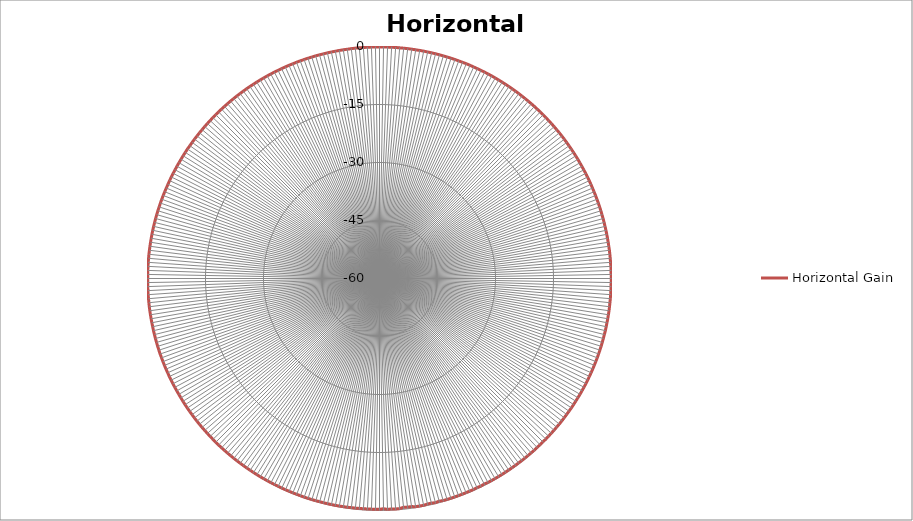
| Category | Horizontal Gain |
|---|---|
| 0 | -0.12 |
| 1 | -0.11 |
| 2 | -0.12 |
| 3 | -0.11 |
| 4 | -0.11 |
| 5 | -0.12 |
| 6 | -0.11 |
| 7 | -0.11 |
| 8 | -0.11 |
| 9 | -0.12 |
| 10 | -0.11 |
| 11 | -0.1 |
| 12 | -0.11 |
| 13 | -0.1 |
| 14 | -0.1 |
| 15 | -0.1 |
| 16 | -0.11 |
| 17 | -0.11 |
| 18 | -0.1 |
| 19 | -0.1 |
| 20 | -0.11 |
| 21 | -0.11 |
| 22 | -0.09 |
| 23 | -0.1 |
| 24 | -0.12 |
| 25 | -0.12 |
| 26 | -0.12 |
| 27 | -0.11 |
| 28 | -0.11 |
| 29 | -0.11 |
| 30 | -0.12 |
| 31 | -0.13 |
| 32 | -0.12 |
| 33 | -0.14 |
| 34 | -0.13 |
| 35 | -0.13 |
| 36 | -0.13 |
| 37 | -0.13 |
| 38 | -0.14 |
| 39 | -0.14 |
| 40 | -0.14 |
| 41 | -0.14 |
| 42 | -0.13 |
| 43 | -0.14 |
| 44 | -0.15 |
| 45 | -0.14 |
| 46 | -0.14 |
| 47 | -0.16 |
| 48 | -0.15 |
| 49 | -0.16 |
| 50 | -0.16 |
| 51 | -0.15 |
| 52 | -0.15 |
| 53 | -0.16 |
| 54 | -0.16 |
| 55 | -0.17 |
| 56 | -0.17 |
| 57 | -0.16 |
| 58 | -0.16 |
| 59 | -0.16 |
| 60 | -0.17 |
| 61 | -0.16 |
| 62 | -0.17 |
| 63 | -0.15 |
| 64 | -0.16 |
| 65 | -0.15 |
| 66 | -0.15 |
| 67 | -0.16 |
| 68 | -0.16 |
| 69 | -0.15 |
| 70 | -0.15 |
| 71 | -0.14 |
| 72 | -0.14 |
| 73 | -0.14 |
| 74 | -0.15 |
| 75 | -0.14 |
| 76 | -0.13 |
| 77 | -0.14 |
| 78 | -0.13 |
| 79 | -0.13 |
| 80 | -0.13 |
| 81 | -0.12 |
| 82 | -0.12 |
| 83 | -0.1 |
| 84 | -0.1 |
| 85 | -0.1 |
| 86 | -0.11 |
| 87 | -0.09 |
| 88 | -0.09 |
| 89 | -0.08 |
| 90 | -0.08 |
| 91 | -0.08 |
| 92 | -0.08 |
| 93 | -0.08 |
| 94 | -0.08 |
| 95 | -0.08 |
| 96 | -0.08 |
| 97 | -0.07 |
| 98 | -0.06 |
| 99 | -0.06 |
| 100 | -0.06 |
| 101 | -0.08 |
| 102 | -0.06 |
| 103 | -0.05 |
| 104 | -0.07 |
| 105 | -0.07 |
| 106 | -0.07 |
| 107 | -0.06 |
| 108 | -0.07 |
| 109 | -0.07 |
| 110 | -0.07 |
| 111 | -0.08 |
| 112 | -0.09 |
| 113 | -0.09 |
| 114 | -0.09 |
| 115 | -0.1 |
| 116 | -0.1 |
| 117 | -0.1 |
| 118 | -0.11 |
| 119 | -0.12 |
| 120 | -0.12 |
| 121 | -0.14 |
| 122 | -0.15 |
| 123 | -0.15 |
| 124 | -0.15 |
| 125 | -0.17 |
| 126 | -0.18 |
| 127 | -0.18 |
| 128 | -0.17 |
| 129 | -0.18 |
| 130 | -0.2 |
| 131 | -0.2 |
| 132 | -0.21 |
| 133 | -0.21 |
| 134 | -0.21 |
| 135 | -0.23 |
| 136 | -0.25 |
| 137 | -0.24 |
| 138 | -0.23 |
| 139 | -0.24 |
| 140 | -0.24 |
| 141 | -0.24 |
| 142 | -0.24 |
| 143 | -0.26 |
| 144 | -0.25 |
| 145 | -0.26 |
| 146 | -0.25 |
| 147 | -0.25 |
| 148 | -0.24 |
| 149 | -0.25 |
| 150 | -0.25 |
| 151 | -0.26 |
| 152 | -0.26 |
| 153 | -0.35 |
| 154 | -0.25 |
| 155 | -0.34 |
| 156 | -0.26 |
| 157 | -0.26 |
| 158 | -0.27 |
| 159 | -0.26 |
| 160 | -0.26 |
| 161 | -0.25 |
| 162 | -0.24 |
| 163 | -0.25 |
| 164 | -0.25 |
| 165 | -0.38 |
| 166 | -0.25 |
| 167 | -0.38 |
| 168 | -0.37 |
| 169 | -0.24 |
| 170 | -0.25 |
| 171 | -0.25 |
| 172 | -0.43 |
| 173 | -0.44 |
| 174 | -0.5 |
| 175 | -0.26 |
| 176 | -0.25 |
| 177 | -0.33 |
| 178 | -0.26 |
| 179 | -0.45 |
| 180 | -0.31 |
| 181 | -0.3 |
| 182 | -0.32 |
| 183 | -0.32 |
| 184 | -0.31 |
| 185 | -0.31 |
| 186 | -0.29 |
| 187 | -0.3 |
| 188 | -0.26 |
| 189 | -0.26 |
| 190 | -0.24 |
| 191 | -0.23 |
| 192 | -0.23 |
| 193 | -0.23 |
| 194 | -0.23 |
| 195 | -0.24 |
| 196 | -0.22 |
| 197 | -0.21 |
| 198 | -0.21 |
| 199 | -0.2 |
| 200 | -0.22 |
| 201 | -0.22 |
| 202 | -0.21 |
| 203 | -0.21 |
| 204 | -0.2 |
| 205 | -0.2 |
| 206 | -0.21 |
| 207 | -0.2 |
| 208 | -0.2 |
| 209 | -0.19 |
| 210 | -0.19 |
| 211 | -0.17 |
| 212 | -0.18 |
| 213 | -0.18 |
| 214 | -0.18 |
| 215 | -0.17 |
| 216 | -0.17 |
| 217 | -0.17 |
| 218 | -0.15 |
| 219 | -0.16 |
| 220 | -0.15 |
| 221 | -0.14 |
| 222 | -0.14 |
| 223 | -0.13 |
| 224 | -0.11 |
| 225 | -0.12 |
| 226 | -0.12 |
| 227 | -0.11 |
| 228 | -0.11 |
| 229 | -0.11 |
| 230 | -0.09 |
| 231 | -0.09 |
| 232 | -0.08 |
| 233 | -0.07 |
| 234 | -0.08 |
| 235 | -0.07 |
| 236 | -0.06 |
| 237 | -0.06 |
| 238 | -0.06 |
| 239 | -0.07 |
| 240 | -0.07 |
| 241 | -0.06 |
| 242 | -0.05 |
| 243 | -0.04 |
| 244 | -0.03 |
| 245 | -0.02 |
| 246 | -0.04 |
| 247 | -0.02 |
| 248 | -0.02 |
| 249 | -0.01 |
| 250 | -0.02 |
| 251 | 0 |
| 252 | -0.01 |
| 253 | -0.01 |
| 254 | -0.01 |
| 255 | -0.01 |
| 256 | -0.02 |
| 257 | -0.01 |
| 258 | -0.03 |
| 259 | -0.02 |
| 260 | -0.02 |
| 261 | -0.02 |
| 262 | -0.02 |
| 263 | -0.02 |
| 264 | -0.03 |
| 265 | -0.03 |
| 266 | -0.03 |
| 267 | -0.03 |
| 268 | -0.04 |
| 269 | -0.04 |
| 270 | -0.03 |
| 271 | -0.05 |
| 272 | -0.03 |
| 273 | -0.05 |
| 274 | -0.04 |
| 275 | -0.05 |
| 276 | -0.04 |
| 277 | -0.05 |
| 278 | -0.05 |
| 279 | -0.05 |
| 280 | -0.05 |
| 281 | -0.05 |
| 282 | -0.05 |
| 283 | -0.05 |
| 284 | -0.06 |
| 285 | -0.06 |
| 286 | -0.07 |
| 287 | -0.07 |
| 288 | -0.08 |
| 289 | -0.07 |
| 290 | -0.08 |
| 291 | -0.09 |
| 292 | -0.1 |
| 293 | -0.11 |
| 294 | -0.11 |
| 295 | -0.1 |
| 296 | -0.11 |
| 297 | -0.11 |
| 298 | -0.12 |
| 299 | -0.11 |
| 300 | -0.12 |
| 301 | -0.12 |
| 302 | -0.11 |
| 303 | -0.11 |
| 304 | -0.1 |
| 305 | -0.13 |
| 306 | -0.12 |
| 307 | -0.11 |
| 308 | -0.12 |
| 309 | -0.11 |
| 310 | -0.12 |
| 311 | -0.1 |
| 312 | -0.11 |
| 313 | -0.11 |
| 314 | -0.1 |
| 315 | -0.1 |
| 316 | -0.09 |
| 317 | -0.1 |
| 318 | -0.1 |
| 319 | -0.1 |
| 320 | -0.09 |
| 321 | -0.1 |
| 322 | -0.09 |
| 323 | -0.1 |
| 324 | -0.1 |
| 325 | -0.09 |
| 326 | -0.1 |
| 327 | -0.11 |
| 328 | -0.1 |
| 329 | -0.1 |
| 330 | -0.11 |
| 331 | -0.1 |
| 332 | -0.11 |
| 333 | -0.1 |
| 334 | -0.12 |
| 335 | -0.11 |
| 336 | -0.1 |
| 337 | -0.1 |
| 338 | -0.12 |
| 339 | -0.1 |
| 340 | -0.1 |
| 341 | -0.11 |
| 342 | -0.11 |
| 343 | -0.12 |
| 344 | -0.1 |
| 345 | -0.11 |
| 346 | -0.12 |
| 347 | -0.11 |
| 348 | -0.12 |
| 349 | -0.12 |
| 350 | -0.12 |
| 351 | -0.12 |
| 352 | -0.13 |
| 353 | -0.11 |
| 354 | -0.1 |
| 355 | -0.11 |
| 356 | -0.12 |
| 357 | -0.11 |
| 358 | -0.12 |
| 359 | -0.11 |